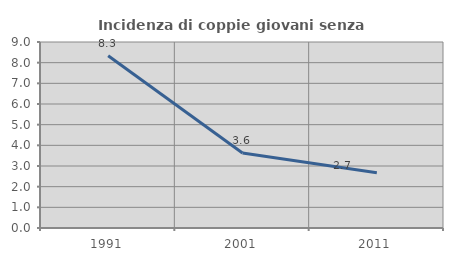
| Category | Incidenza di coppie giovani senza figli |
|---|---|
| 1991.0 | 8.333 |
| 2001.0 | 3.627 |
| 2011.0 | 2.679 |